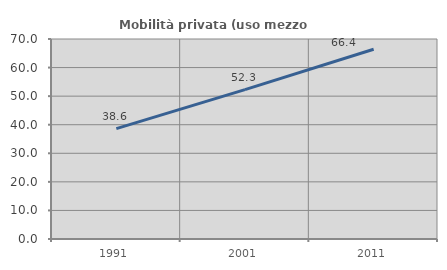
| Category | Mobilità privata (uso mezzo privato) |
|---|---|
| 1991.0 | 38.629 |
| 2001.0 | 52.268 |
| 2011.0 | 66.415 |